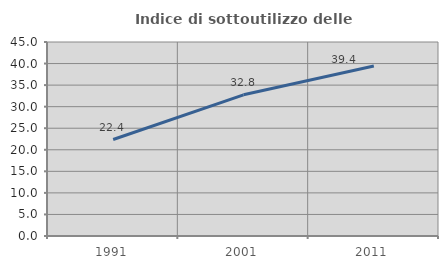
| Category | Indice di sottoutilizzo delle abitazioni  |
|---|---|
| 1991.0 | 22.379 |
| 2001.0 | 32.75 |
| 2011.0 | 39.425 |